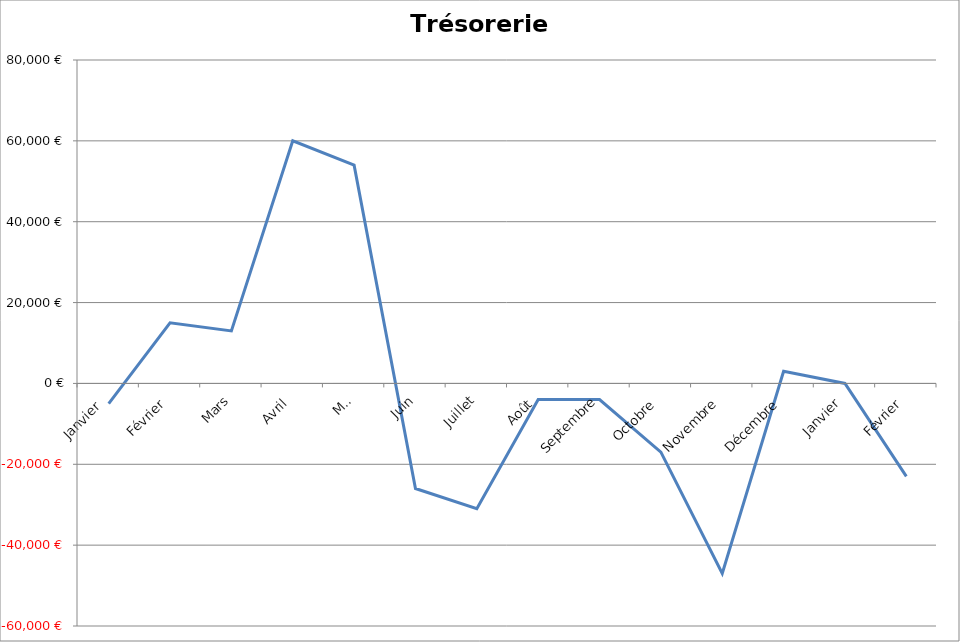
| Category | Trésorerie  |
|---|---|
| Janvier  | -5000 |
| Février | 15000 |
| Mars | 13000 |
| Avril | 60000 |
| Mai | 54000 |
| Juin | -26000 |
| Juillet | -31000 |
| Août | -4000 |
| Septembre | -4000 |
| Octobre | -17000 |
| Novembre | -47000 |
| Décembre | 3000 |
| Janvier | 0 |
| Février | -23000 |